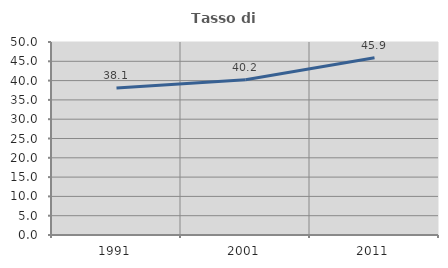
| Category | Tasso di occupazione   |
|---|---|
| 1991.0 | 38.06 |
| 2001.0 | 40.208 |
| 2011.0 | 45.898 |